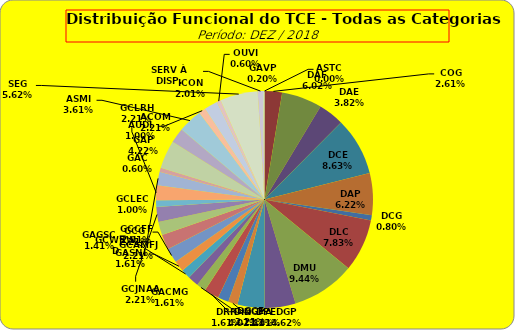
| Category | ASTC |
|---|---|
| ASTC | 0 |
| COG | 13 |
| DAF | 30 |
| DAE | 19 |
| DCE | 43 |
| DAP | 31 |
| DCG | 4 |
| DLC | 39 |
| DMU | 47 |
| DGP | 23 |
| DIN | 20 |
| DPE | 7 |
| DRR | 8 |
| DGCE | 11 |
| DGPA | 7 |
| GACMG | 8 |
| GAGSC | 7 |
| GASNI | 8 |
| GCG | 11 |
| GCAMFJ | 11 |
| GCCFF | 10 |
| GCJNAA | 11 |
| GCLEC | 5 |
| GCLRH | 11 |
| GCWRWD | 10 |
| GAC | 3 |
| GAP | 21 |
| ACOM | 11 |
| ASMI | 18 |
| AUDI | 5 |
| ICON | 10 |
| OUVI | 3 |
| SEG | 28 |
| SERV À DISP. | 4 |
| GAVP | 1 |